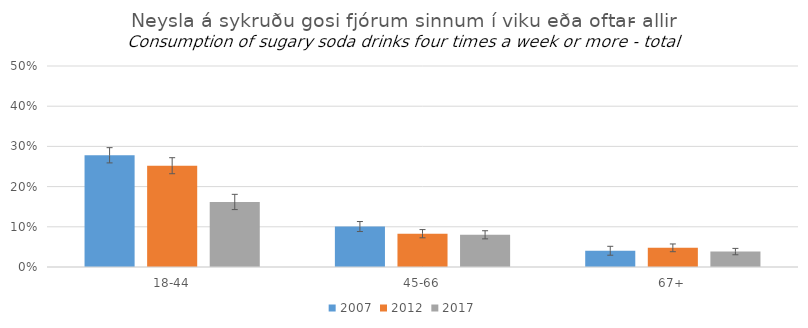
| Category | 2007 | 2012 | 2017 |
|---|---|---|---|
| 18-44 | 0.278 | 0.252 | 0.162 |
| 45-66 | 0.101 | 0.083 | 0.08 |
| 67+ | 0.04 | 0.048 | 0.038 |